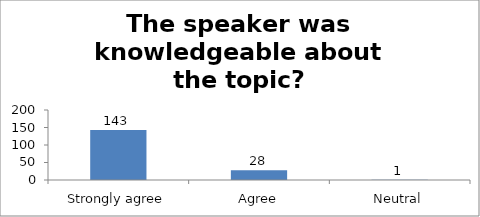
| Category | The speaker was knowledgeable about the topic? |
|---|---|
| Strongly agree | 143 |
| Agree | 28 |
| Neutral | 1 |